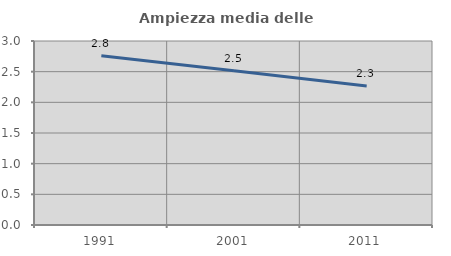
| Category | Ampiezza media delle famiglie |
|---|---|
| 1991.0 | 2.759 |
| 2001.0 | 2.514 |
| 2011.0 | 2.265 |